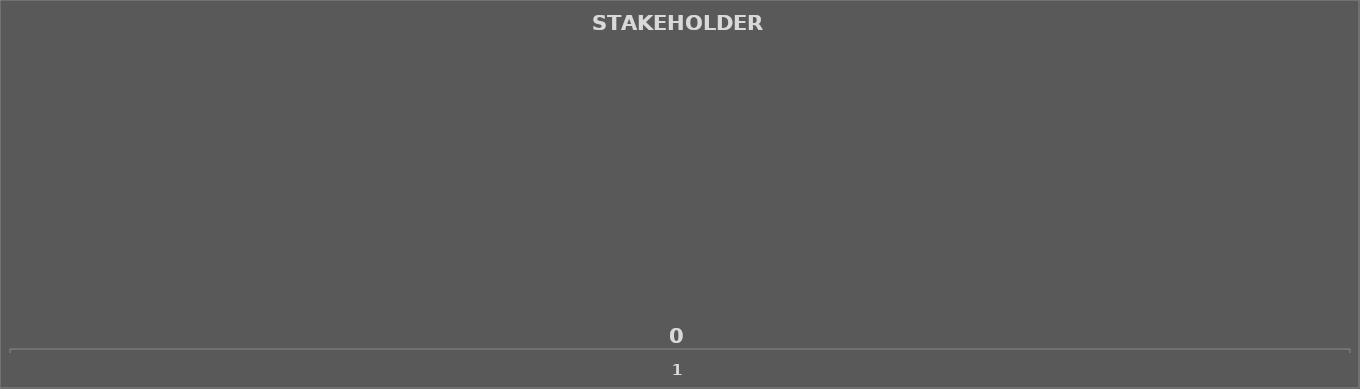
| Category | STAKEHOLDERS |
|---|---|
| 0 | 0 |